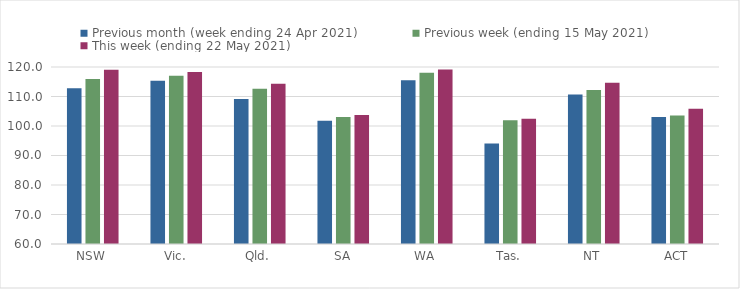
| Category | Previous month (week ending 24 Apr 2021) | Previous week (ending 15 May 2021) | This week (ending 22 May 2021) |
|---|---|---|---|
| NSW | 112.8 | 115.94 | 119.11 |
| Vic. | 115.34 | 117.04 | 118.34 |
| Qld. | 109.17 | 112.65 | 114.3 |
| SA | 101.81 | 103.03 | 103.77 |
| WA | 115.54 | 118.06 | 119.16 |
| Tas. | 94.05 | 101.95 | 102.49 |
| NT | 110.67 | 112.19 | 114.7 |
| ACT | 103.05 | 103.54 | 105.81 |